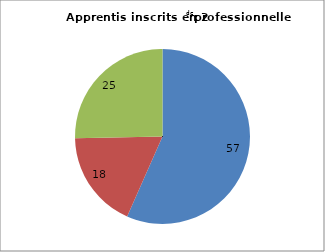
| Category | Series 0 |
|---|---|
| Au moins un vœu en apprentissage | 56.624 |
| Au moins un vœu en voie professionnelle scolaire (et pas de vœu en apprentissage) | 18.055 |
| Aucun vœu en voie professionnelle (et pas de vœu en apprentissage) | 25.321 |